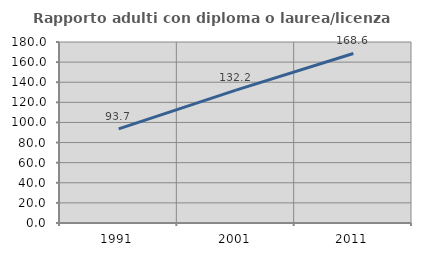
| Category | Rapporto adulti con diploma o laurea/licenza media  |
|---|---|
| 1991.0 | 93.659 |
| 2001.0 | 132.197 |
| 2011.0 | 168.58 |